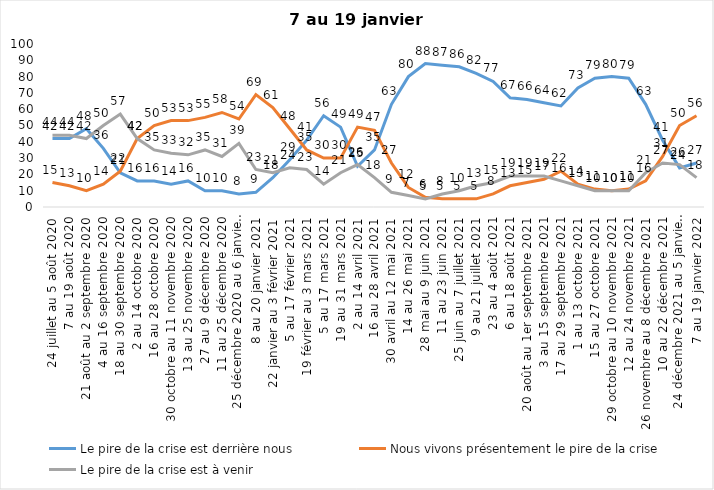
| Category | Le pire de la crise est derrière nous | Nous vivons présentement le pire de la crise | Le pire de la crise est à venir |
|---|---|---|---|
| 24 juillet au 5 août 2020 | 42 | 15 | 44 |
| 7 au 19 août 2020 | 42 | 13 | 44 |
| 21 août au 2 septembre 2020 | 48 | 10 | 42 |
| 4 au 16 septembre 2020 | 36 | 14 | 50 |
| 18 au 30 septembre 2020 | 21 | 22 | 57 |
| 2 au 14 octobre 2020 | 16 | 42 | 42 |
| 16 au 28 octobre 2020 | 16 | 50 | 35 |
| 30 octobre au 11 novembre 2020 | 14 | 53 | 33 |
| 13 au 25 novembre 2020 | 16 | 53 | 32 |
| 27 au 9 décembre 2020 | 10 | 55 | 35 |
| 11 au 25 décembre 2020 | 10 | 58 | 31 |
| 25 décembre 2020 au 6 janvier 2021 | 8 | 54 | 39 |
| 8 au 20 janvier 2021 | 9 | 69 | 23 |
| 22 janvier au 3 février 2021 | 18 | 61 | 21 |
| 5 au 17 février 2021 | 29 | 48 | 24 |
| 19 février au 3 mars 2021 | 41 | 35 | 23 |
| 5 au 17 mars 2021 | 56 | 30 | 14 |
| 19 au 31 mars 2021 | 49 | 30 | 21 |
| 2 au 14 avril 2021 | 25 | 49 | 26 |
| 16 au 28 avril 2021 | 35 | 47 | 18 |
| 30 avril au 12 mai 2021 | 63 | 27 | 9 |
| 14 au 26 mai 2021 | 80 | 12 | 7 |
| 28 mai au 9 juin 2021 | 88 | 6 | 5 |
| 11 au 23 juin 2021 | 87 | 5 | 8 |
| 25 juin au 7 juillet 2021 | 86 | 5 | 10 |
| 9 au 21 juillet 2021 | 82 | 5 | 13 |
| 23 au 4 août 2021 | 77 | 8 | 15 |
| 6 au 18 août 2021 | 67 | 13 | 19 |
| 20 août au 1er septembre 2021 | 66 | 15 | 19 |
| 3 au 15 septembre 2021 | 64 | 17 | 19 |
| 17 au 29 septembre 2021 | 62 | 22 | 16 |
| 1 au 13 octobre 2021 | 73 | 14 | 13 |
| 15 au 27 octobre 2021 | 79 | 11 | 10 |
| 29 octobre au 10 novembre 2021 | 80 | 10 | 10 |
| 12 au 24 novembre 2021 | 79 | 11 | 10 |
| 26 novembre au 8 décembre 2021 | 63 | 16 | 21 |
| 10 au 22 décembre 2021 | 41 | 31 | 27 |
| 24 décembre 2021 au 5 janvier 2022 2022 | 24 | 50 | 26 |
| 7 au 19 janvier 2022 | 27 | 56 | 18 |